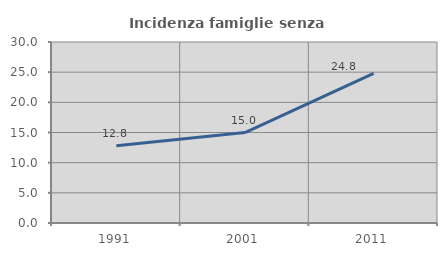
| Category | Incidenza famiglie senza nuclei |
|---|---|
| 1991.0 | 12.823 |
| 2001.0 | 14.985 |
| 2011.0 | 24.807 |